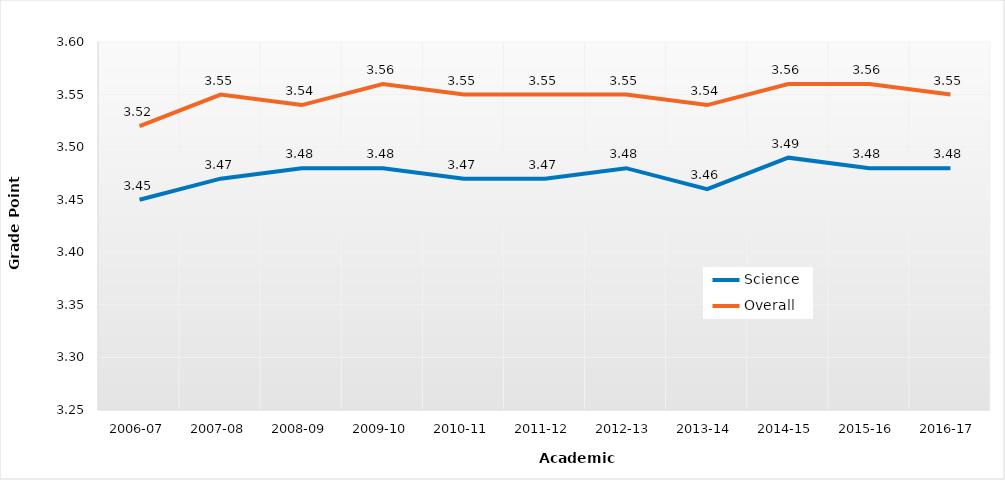
| Category | Science | Overall |
|---|---|---|
| 2006-07 | 3.45 | 3.52 |
| 2007-08 | 3.47 | 3.55 |
| 2008-09 | 3.48 | 3.54 |
| 2009-10 | 3.48 | 3.56 |
| 2010-11 | 3.47 | 3.55 |
| 2011-12 | 3.47 | 3.55 |
| 2012-13 | 3.48 | 3.55 |
| 2013-14 | 3.46 | 3.54 |
| 2014-15 | 3.49 | 3.56 |
| 2015-16 | 3.48 | 3.56 |
| 2016-17 | 3.48 | 3.55 |